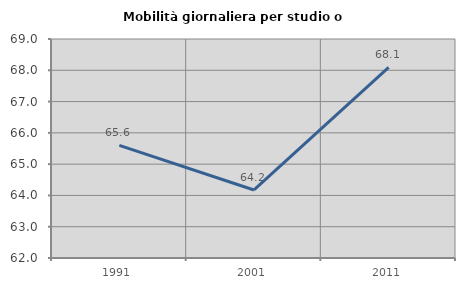
| Category | Mobilità giornaliera per studio o lavoro |
|---|---|
| 1991.0 | 65.598 |
| 2001.0 | 64.174 |
| 2011.0 | 68.093 |